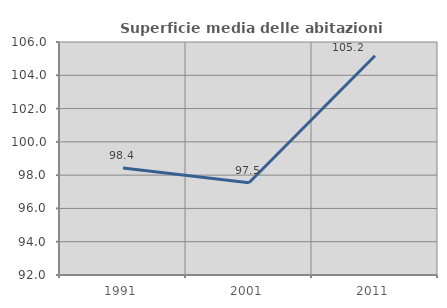
| Category | Superficie media delle abitazioni occupate |
|---|---|
| 1991.0 | 98.436 |
| 2001.0 | 97.543 |
| 2011.0 | 105.172 |